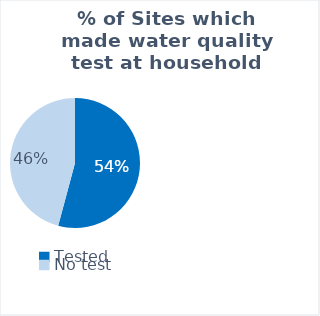
| Category | Central Rakhine |
|---|---|
| Tested | 13 |
| No test | 11 |